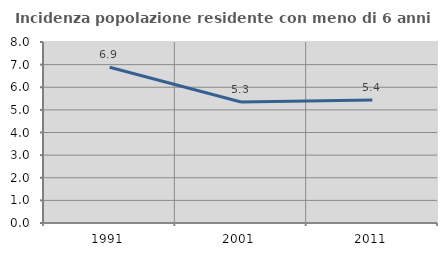
| Category | Incidenza popolazione residente con meno di 6 anni |
|---|---|
| 1991.0 | 6.882 |
| 2001.0 | 5.345 |
| 2011.0 | 5.44 |